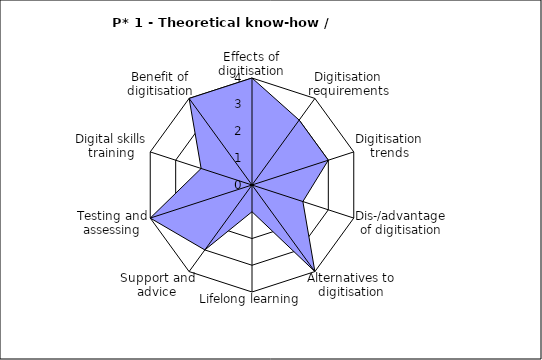
| Category | Series 0 |
|---|---|
| Effects of digitisation | 4 |
| Digitisation requirements | 3 |
| Digitisation trends | 3 |
| Dis-/advantage of digitisation | 2 |
| Alternatives to digitisation | 4 |
| Lifelong learning | 1 |
| Support and advice | 3 |
| Testing and assessing | 4 |
| Digital skills training | 2 |
| Benefit of digitisation | 4 |